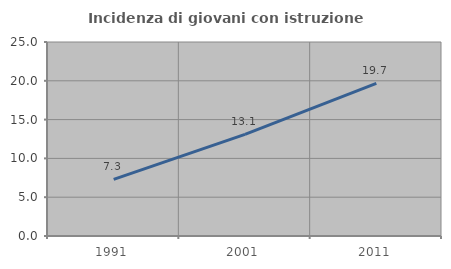
| Category | Incidenza di giovani con istruzione universitaria |
|---|---|
| 1991.0 | 7.292 |
| 2001.0 | 13.095 |
| 2011.0 | 19.672 |